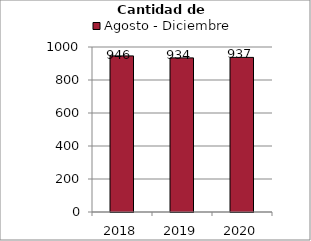
| Category | Agosto - Diciembre |
|---|---|
| 2018.0 | 946 |
| 2019.0 | 934 |
| 2020.0 | 937 |